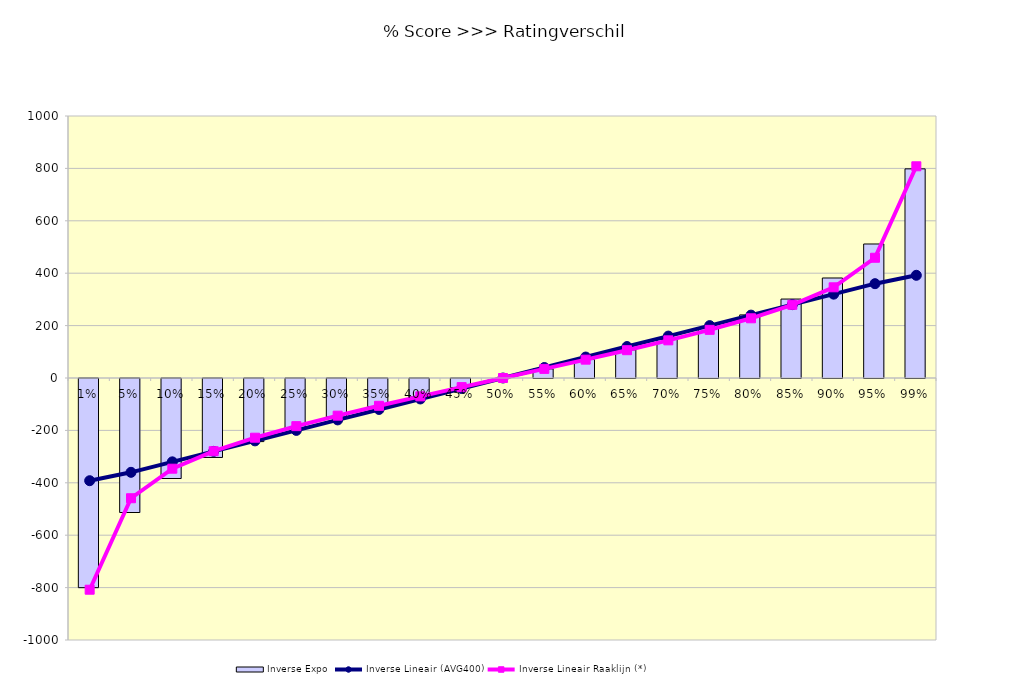
| Category | Inverse Expo |
|---|---|
| 0.01 | -798.254 |
| 0.05 | -511.501 |
| 0.1 | -381.697 |
| 0.15 | -301.331 |
| 0.2 | -240.824 |
| 0.25 | -190.849 |
| 0.3 | -147.191 |
| 0.35 | -107.538 |
| 0.4 | -70.437 |
| 0.45 | -34.86 |
| 0.5 | 0 |
| 0.55 | 34.86 |
| 0.6 | 70.437 |
| 0.65 | 107.538 |
| 0.7 | 147.191 |
| 0.75 | 190.849 |
| 0.8 | 240.824 |
| 0.85 | 301.331 |
| 0.9 | 381.697 |
| 0.95 | 511.501 |
| 0.99 | 798.254 |